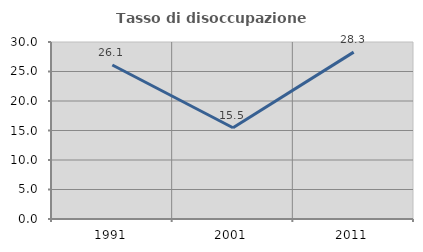
| Category | Tasso di disoccupazione giovanile  |
|---|---|
| 1991.0 | 26.102 |
| 2001.0 | 15.47 |
| 2011.0 | 28.283 |